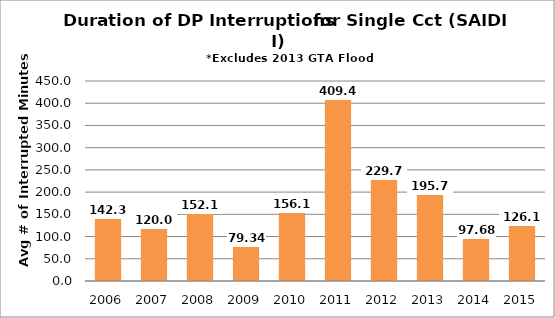
| Category | T-SAIDI-sc |
|---|---|
| 2006.0 | 142.318 |
| 2007.0 | 120.054 |
| 2008.0 | 152.166 |
| 2009.0 | 79.336 |
| 2010.0 | 156.101 |
| 2011.0 | 409.414 |
| 2012.0 | 229.73 |
| 2013.0 | 195.79 |
| 2014.0 | 97.681 |
| 2015.0 | 126.192 |